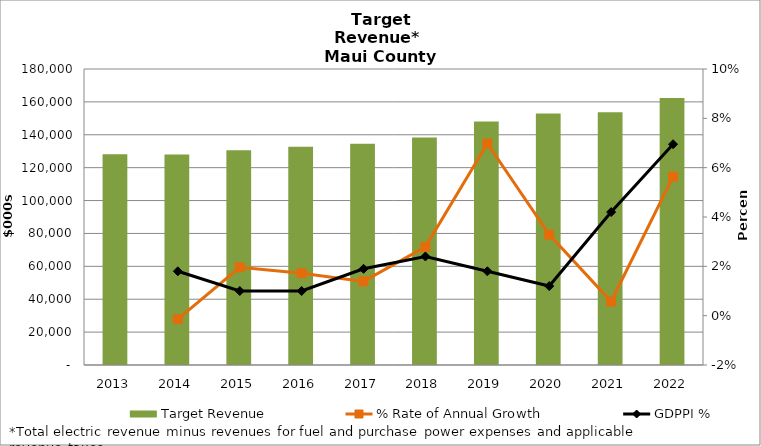
| Category | Target Revenue |
|---|---|
| 2013.0 | 128189.606 |
| 2014.0 | 128009.438 |
| 2015.0 | 130522.493 |
| 2016.0 | 132770.976 |
| 2017.0 | 134615.754 |
| 2018.0 | 138373.36 |
| 2019.0 | 148030.379 |
| 2020.0 | 152894.117 |
| 2021.0 | 153770.143 |
| 2022.0 | 162434.342 |